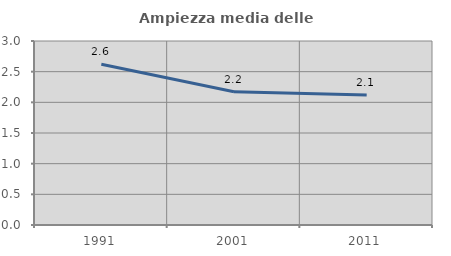
| Category | Ampiezza media delle famiglie |
|---|---|
| 1991.0 | 2.621 |
| 2001.0 | 2.171 |
| 2011.0 | 2.119 |